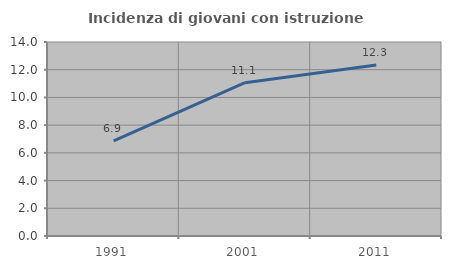
| Category | Incidenza di giovani con istruzione universitaria |
|---|---|
| 1991.0 | 6.857 |
| 2001.0 | 11.06 |
| 2011.0 | 12.346 |